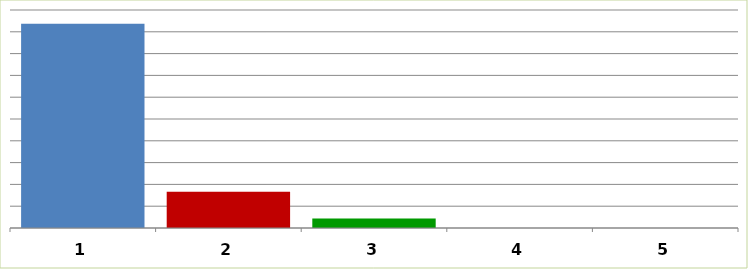
| Category | Series 0 |
|---|---|
| 0 | 46853029 |
| 1 | 8306457 |
| 2 | 2202014 |
| 3 | 0 |
| 4 | 0 |